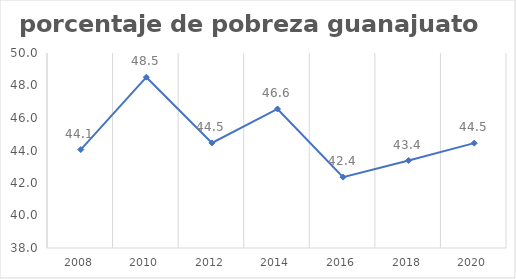
| Category | Series 0 |
|---|---|
| 2008.0 | 44.058 |
| 2010.0 | 48.512 |
| 2012.0 | 44.467 |
| 2014.0 | 46.555 |
| 2016.0 | 42.36 |
| 2018.0 | 43.384 |
| 2020.0 | 44.452 |